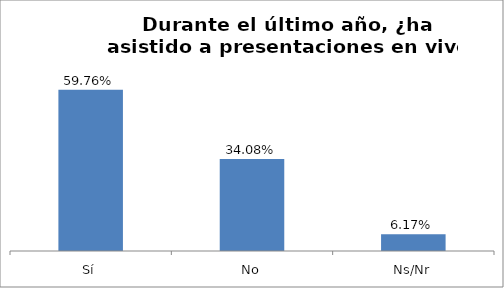
| Category | Total |
|---|---|
| Sí | 0.598 |
| No | 0.341 |
| Ns/Nr | 0.062 |